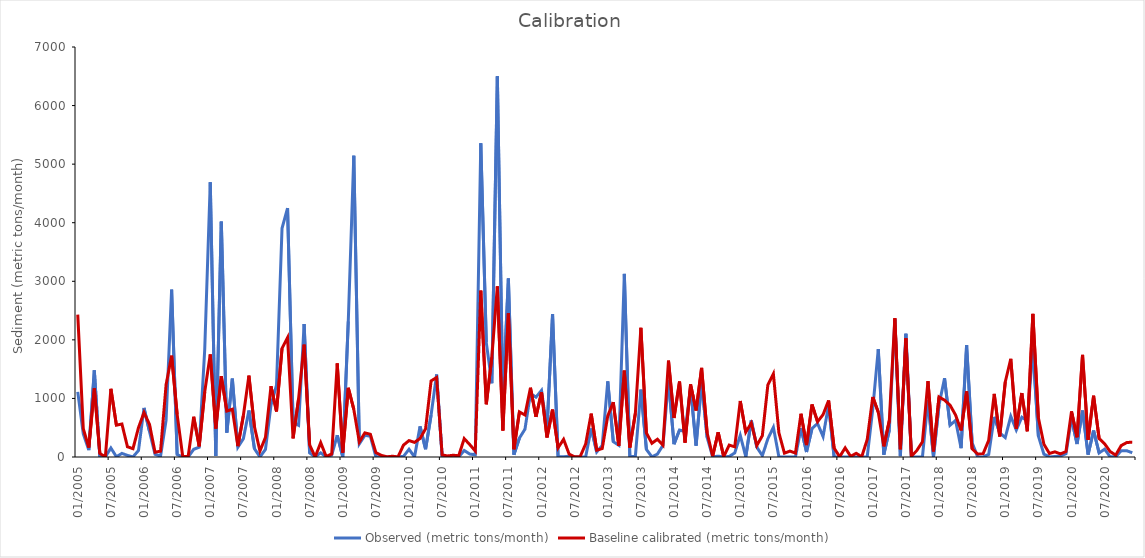
| Category | Observed (metric tons/month) | Baseline calibrated (metric tons/month) |
|---|---|---|
| 2005-01-01 | 1112.792 | 2432 |
| 2005-02-01 | 395.542 | 484.3 |
| 2005-03-01 | 117.081 | 161.7 |
| 2005-04-01 | 1477.958 | 1173 |
| 2005-05-01 | 6.426 | 60.74 |
| 2005-06-01 | 2.286 | 1.77 |
| 2005-07-01 | 153.909 | 1164 |
| 2005-08-01 | 4.252 | 543.5 |
| 2005-09-01 | 61.66 | 563.1 |
| 2005-10-01 | 27.626 | 175 |
| 2005-11-01 | 1.826 | 141.8 |
| 2005-12-01 | 111.142 | 501.8 |
| 2006-01-01 | 837.56 | 759.9 |
| 2006-02-01 | 433.977 | 554.8 |
| 2006-03-01 | 46.85 | 81.12 |
| 2006-04-01 | 14.796 | 100.5 |
| 2006-05-01 | 628.836 | 1236 |
| 2006-06-01 | 2857.52 | 1729 |
| 2006-07-01 | 41.612 | 728.1 |
| 2006-08-01 | 3.128 | 17.14 |
| 2006-09-01 | 0.909 | 9.707 |
| 2006-10-01 | 130.773 | 688.3 |
| 2006-11-01 | 168.737 | 183 |
| 2006-12-01 | 1839.277 | 1113 |
| 2007-01-01 | 4689.724 | 1751 |
| 2007-02-01 | 16.757 | 486.3 |
| 2007-03-01 | 4018.138 | 1379 |
| 2007-04-01 | 416.735 | 785.3 |
| 2007-05-01 | 1338.161 | 815.7 |
| 2007-06-01 | 168.63 | 185.7 |
| 2007-07-01 | 313.92 | 710.2 |
| 2007-08-01 | 795.094 | 1390 |
| 2007-09-01 | 143.284 | 517.5 |
| 2007-10-01 | 0.891 | 101.8 |
| 2007-11-01 | 128.274 | 335 |
| 2007-12-01 | 885.869 | 1209 |
| 2008-01-01 | 1225.207 | 777 |
| 2008-02-01 | 3905.095 | 1854 |
| 2008-03-01 | 4250.305 | 2038 |
| 2008-04-01 | 592.113 | 318.1 |
| 2008-05-01 | 542.516 | 997.3 |
| 2008-06-01 | 2270.933 | 1919 |
| 2008-07-01 | 70.439 | 206.5 |
| 2008-08-01 | 3.334 | 0.797 |
| 2008-09-01 | 72.558 | 244.9 |
| 2008-10-01 | 0.814 | 6.124 |
| 2008-11-01 | 32.698 | 52.33 |
| 2008-12-01 | 370.873 | 1598 |
| 2009-01-01 | 2.875 | 76.15 |
| 2009-02-01 | 2315.547 | 1182 |
| 2009-03-01 | 5144.702 | 813 |
| 2009-04-01 | 224.323 | 256.7 |
| 2009-05-01 | 369.754 | 412 |
| 2009-06-01 | 353.844 | 388.3 |
| 2009-07-01 | 3.25 | 74.79 |
| 2009-08-01 | 2.423 | 27.38 |
| 2009-09-01 | 0.829 | 3.336 |
| 2009-10-01 | 0.746 | 13.14 |
| 2009-11-01 | 0.496 | 1.578 |
| 2009-12-01 | 11.785 | 203 |
| 2010-01-01 | 131.592 | 280.1 |
| 2010-02-01 | 1.96 | 249.9 |
| 2010-03-01 | 522.604 | 316.2 |
| 2010-04-01 | 133.858 | 481.4 |
| 2010-05-01 | 716.59 | 1299 |
| 2010-06-01 | 1408.543 | 1357 |
| 2010-07-01 | 7.663 | 34.97 |
| 2010-08-01 | 3.689 | 18.24 |
| 2010-09-01 | 2.122 | 30.11 |
| 2010-10-01 | 0.844 | 21.24 |
| 2010-11-01 | 110.602 | 314 |
| 2010-12-01 | 50.045 | 212.1 |
| 2011-01-01 | 38.5 | 103.2 |
| 2011-02-01 | 5355.459 | 2841 |
| 2011-03-01 | 1952.153 | 900.4 |
| 2011-04-01 | 1260.131 | 1701 |
| 2011-05-01 | 6499.868 | 2913 |
| 2011-06-01 | 984.061 | 452.1 |
| 2011-07-01 | 3047.838 | 2454 |
| 2011-08-01 | 38.703 | 132.7 |
| 2011-09-01 | 323.215 | 768.9 |
| 2011-10-01 | 474.912 | 716.5 |
| 2011-11-01 | 1084.883 | 1183 |
| 2011-12-01 | 1021.548 | 685.2 |
| 2012-01-01 | 1137.2 | 1105 |
| 2012-02-01 | 471.784 | 333.9 |
| 2012-03-01 | 2441.156 | 809.4 |
| 2012-04-01 | 6.325 | 157.5 |
| 2012-05-01 | 5.877 | 301.4 |
| 2012-06-01 | 11.855 | 48.78 |
| 2012-07-01 | 2.324 | 3.523 |
| 2012-08-01 | 1.433 | 6.697 |
| 2012-09-01 | 2.644 | 222.9 |
| 2012-10-01 | 487.524 | 740.2 |
| 2012-11-01 | 86.284 | 116.3 |
| 2012-12-01 | 198.355 | 144.5 |
| 2013-01-01 | 1290.43 | 701.2 |
| 2013-02-01 | 262.147 | 936.6 |
| 2013-03-01 | 200.946 | 189.6 |
| 2013-04-01 | 3125.995 | 1474 |
| 2013-05-01 | 6.417 | 160.8 |
| 2013-06-01 | 10.761 | 746.4 |
| 2013-07-01 | 1148.902 | 2206 |
| 2013-08-01 | 129.622 | 409.7 |
| 2013-09-01 | 2.27 | 234 |
| 2013-10-01 | 49.329 | 301.9 |
| 2013-11-01 | 201.963 | 201.4 |
| 2013-12-01 | 1308.626 | 1645 |
| 2014-01-01 | 218.558 | 666.8 |
| 2014-02-01 | 460.622 | 1288 |
| 2014-03-01 | 435.365 | 246.1 |
| 2014-04-01 | 1185.687 | 1240 |
| 2014-05-01 | 194.892 | 795 |
| 2014-06-01 | 1277.788 | 1522 |
| 2014-07-01 | 334.628 | 411.8 |
| 2014-08-01 | 3.714 | 13.66 |
| 2014-09-01 | 13.771 | 421.8 |
| 2014-10-01 | 1.212 | 5.578 |
| 2014-11-01 | 8.838 | 202.9 |
| 2014-12-01 | 69.745 | 173.1 |
| 2015-01-01 | 370.343 | 956.3 |
| 2015-02-01 | 5.138 | 423.6 |
| 2015-03-01 | 624.38 | 580.1 |
| 2015-04-01 | 167.166 | 196.5 |
| 2015-05-01 | 23.558 | 363.8 |
| 2015-06-01 | 310.437 | 1231 |
| 2015-07-01 | 506.719 | 1419 |
| 2015-08-01 | 1.755 | 412.6 |
| 2015-09-01 | 1.266 | 65.34 |
| 2015-10-01 | 2.047 | 100.8 |
| 2015-11-01 | 1.302 | 66.64 |
| 2015-12-01 | 495.048 | 738 |
| 2016-01-01 | 85.357 | 203.4 |
| 2016-02-01 | 486.709 | 895.9 |
| 2016-03-01 | 571.907 | 602.3 |
| 2016-04-01 | 349.22 | 723.8 |
| 2016-05-01 | 887.674 | 965.1 |
| 2016-06-01 | 2.849 | 152.5 |
| 2016-07-01 | 1.121 | 4.211 |
| 2016-08-01 | 1.39 | 155.8 |
| 2016-09-01 | 1.087 | 11.16 |
| 2016-10-01 | 1.121 | 63.01 |
| 2016-11-01 | 0.768 | 4.13 |
| 2016-12-01 | 5.656 | 299.4 |
| 2017-01-01 | 822.731 | 1025 |
| 2017-02-01 | 1842.166 | 764.4 |
| 2017-03-01 | 38.19 | 181.7 |
| 2017-04-01 | 458.898 | 623 |
| 2017-05-01 | 2351.093 | 2371 |
| 2017-06-01 | 15.611 | 132.6 |
| 2017-07-01 | 2103.371 | 2028 |
| 2017-08-01 | 2.037 | 12.91 |
| 2017-09-01 | 1.278 | 112.5 |
| 2017-10-01 | 0.977 | 259.4 |
| 2017-11-01 | 965.035 | 1295 |
| 2017-12-01 | 3.284 | 97.03 |
| 2018-01-01 | 888.682 | 1025 |
| 2018-02-01 | 1345.565 | 970.6 |
| 2018-03-01 | 541.719 | 885.6 |
| 2018-04-01 | 624.114 | 716.7 |
| 2018-05-01 | 150.292 | 453.6 |
| 2018-06-01 | 1909.631 | 1119 |
| 2018-07-01 | 242.141 | 141.1 |
| 2018-08-01 | 2.408 | 50.73 |
| 2018-09-01 | 1.503 | 57.32 |
| 2018-10-01 | 45.092 | 285.8 |
| 2018-11-01 | 685.102 | 1078 |
| 2018-12-01 | 413.662 | 350.8 |
| 2019-01-01 | 332.085 | 1282 |
| 2019-02-01 | 694.71 | 1677 |
| 2019-03-01 | 460.825 | 481.8 |
| 2019-04-01 | 679.814 | 1091 |
| 2019-05-01 | 617.487 | 440 |
| 2019-06-01 | 1849.715 | 2443 |
| 2019-07-01 | 357.372 | 669.9 |
| 2019-08-01 | 47.879 | 218 |
| 2019-09-01 | 1.528 | 59.24 |
| 2019-10-01 | 8.551 | 88.73 |
| 2019-11-01 | 16.733 | 53.81 |
| 2019-12-01 | 58.105 | 93.67 |
| 2020-01-01 | 655.473 | 778.9 |
| 2020-02-01 | 222.008 | 337.4 |
| 2020-03-01 | 792.611 | 1743 |
| 2020-04-01 | 40.13 | 293.8 |
| 2020-05-01 | 451.297 | 1046 |
| 2020-06-01 | 69.409 | 315.6 |
| 2020-07-01 | 133.568 | 224.5 |
| 2020-08-01 | 3.082 | 92.65 |
| 2020-09-01 | 2.942 | 32.26 |
| 2020-10-01 | 107.505 | 194.9 |
| 2020-11-01 | 107.087 | 245.9 |
| 2020-12-01 | 72.338 | 254.3 |